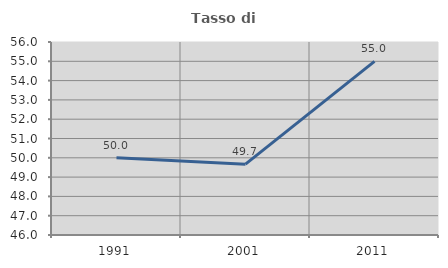
| Category | Tasso di occupazione   |
|---|---|
| 1991.0 | 50 |
| 2001.0 | 49.671 |
| 2011.0 | 55 |